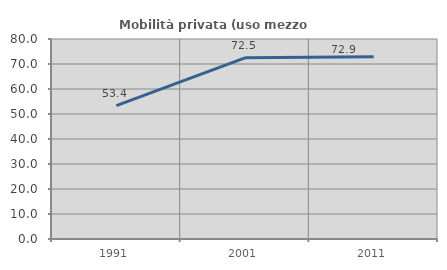
| Category | Mobilità privata (uso mezzo privato) |
|---|---|
| 1991.0 | 53.362 |
| 2001.0 | 72.454 |
| 2011.0 | 72.936 |